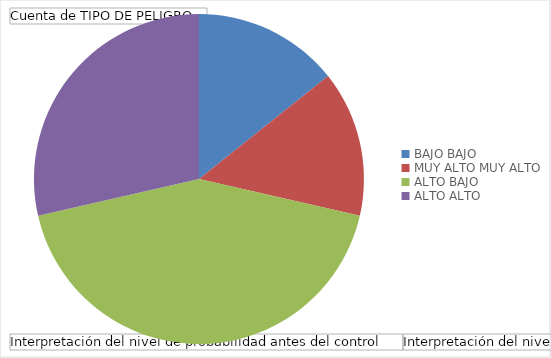
| Category | Total |
|---|---|
| 0 | 1 |
| 1 | 1 |
| 2 | 3 |
| 3 | 2 |